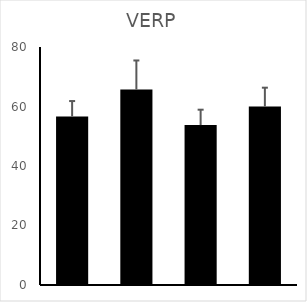
| Category | VERP |
|---|---|
| 0 | 56.667 |
| 1 | 65.714 |
| 2 | 53.75 |
| 3 | 60 |